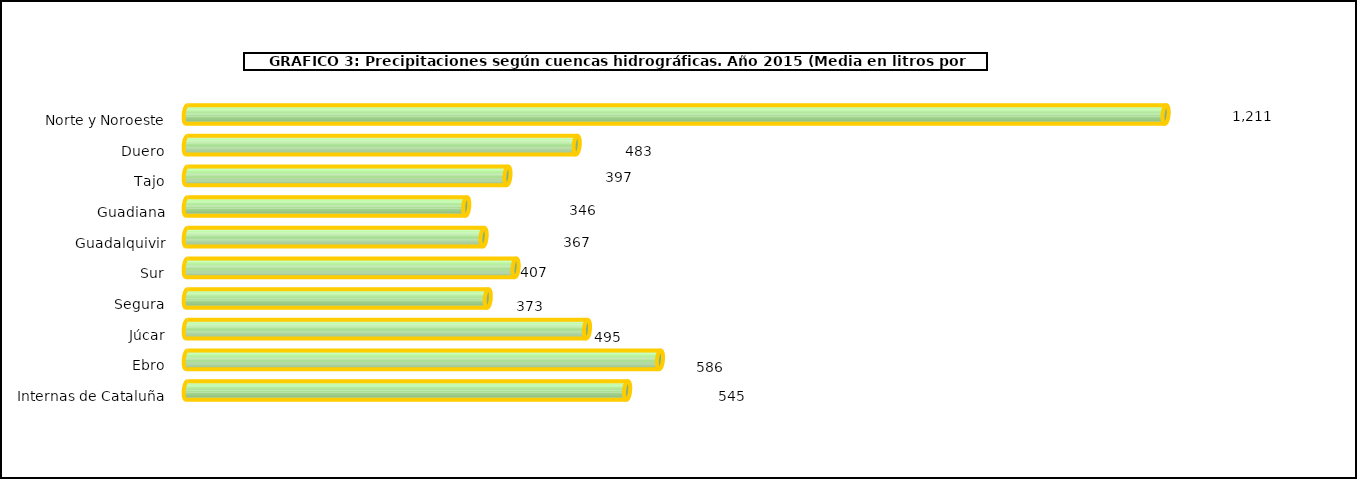
| Category | cuencas |
|---|---|
| 0 | 1211.1 |
| 1 | 482.5 |
| 2 | 396.8 |
| 3 | 345.8 |
| 4 | 367.3 |
| 5 | 406.9 |
| 6 | 372.5 |
| 7 | 495.2 |
| 8 | 585.5 |
| 9 | 544.9 |